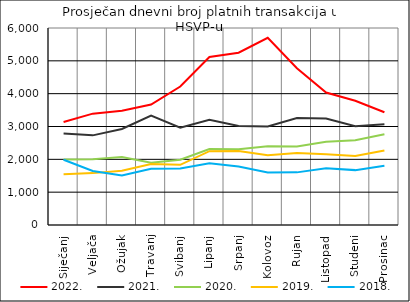
| Category | 2022. | 2021. | 2020. | 2019. | 2018. |
|---|---|---|---|---|---|
| Siječanj | 3136.05 | 2785.263 | 1995 | 1547.409 | 1988.182 |
| Veljača | 3391.7 | 2730.2 | 2005.5 | 1580 | 1644.85 |
| Ožujak | 3480.435 | 2925.739 | 2073.227 | 1650.81 | 1510.545 |
| Travanj | 3667.8 | 3333.143 | 1899.857 | 1855.381 | 1715.55 |
| Svibanj | 4216 | 2962.286 | 1990.4 | 1833.818 | 1721.714 |
| Lipanj | 5117.15 | 3207.65 | 2311.8 | 2248.444 | 1881.158 |
| Srpanj | 5247.19 | 3016.864 | 2306.913 | 2252.435 | 1781.091 |
| Kolovoz | 5702.429 | 3003.286 | 2394.7 | 2125.8 | 1597.364 |
| Rujan | 4776.182 | 3260.636 | 2392.727 | 2193.333 | 1602.9 |
| Listopad | 4035.667 | 3239.952 | 2532.045 | 2152.5 | 1727.318 |
| Studeni | 3783.95 | 3006.45 | 2580.6 | 2098.6 | 1671.381 |
| Prosinac | 3432.524 | 3072.217 | 2764.227 | 2272 | 1804.474 |